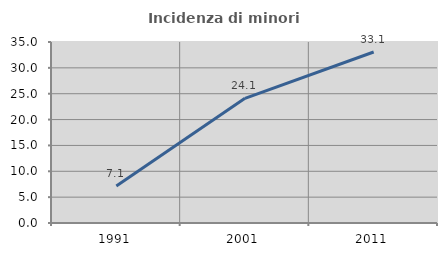
| Category | Incidenza di minori stranieri |
|---|---|
| 1991.0 | 7.143 |
| 2001.0 | 24.107 |
| 2011.0 | 33.073 |